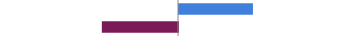
| Category | Series 0 |
|---|---|
| Favorable | 0.418 |
| Unfavorable | -0.43 |